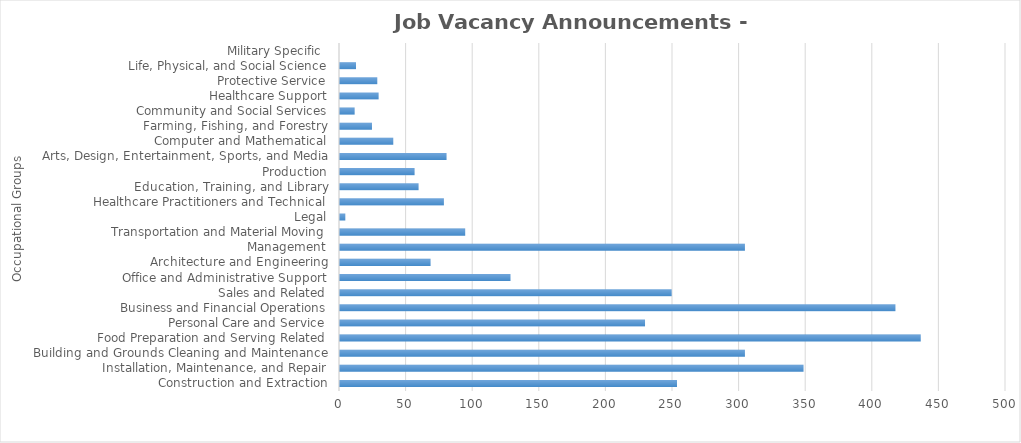
| Category | Total JVAs |
|---|---|
| Construction and Extraction | 253 |
| Installation, Maintenance, and Repair | 348 |
| Building and Grounds Cleaning and Maintenance | 304 |
| Food Preparation and Serving Related | 436 |
| Personal Care and Service | 229 |
| Business and Financial Operations | 417 |
| Sales and Related | 249 |
| Office and Administrative Support | 128 |
| Architecture and Engineering | 68 |
| Management | 304 |
| Transportation and Material Moving | 94 |
| Legal | 4 |
| Healthcare Practitioners and Technical | 78 |
| Education, Training, and Library | 59 |
| Production | 56 |
| Arts, Design, Entertainment, Sports, and Media | 80 |
| Computer and Mathematical | 40 |
| Farming, Fishing, and Forestry | 24 |
| Community and Social Services | 11 |
| Healthcare Support | 29 |
| Protective Service | 28 |
| Life, Physical, and Social Science | 12 |
| Military Specific  | 0 |